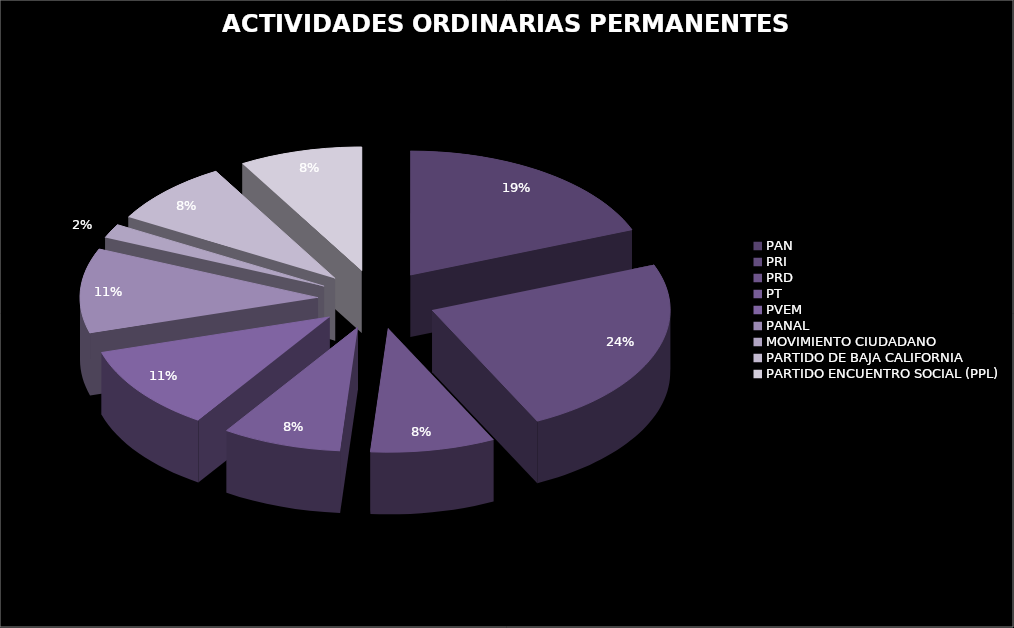
| Category | Series 0 |
|---|---|
| PAN | 2875363.17 |
| PRI | 3575583.2 |
| PRD | 1279265.75 |
| PT | 1224071.55 |
| PVEM | 1670600.03 |
| PANAL | 1670600.03 |
| MOVIMIENTO CIUDADANO | 277913.81 |
| PARTIDO DE BAJA CALIFORNIA | 1265310.51 |
| PARTIDO ENCUENTRO SOCIAL (PPL) | 1261275.73 |